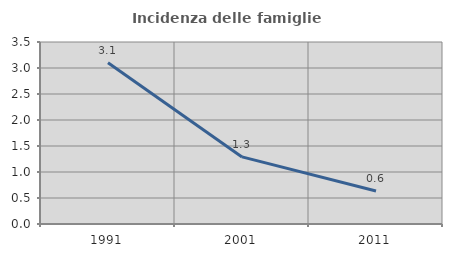
| Category | Incidenza delle famiglie numerose |
|---|---|
| 1991.0 | 3.099 |
| 2001.0 | 1.29 |
| 2011.0 | 0.634 |